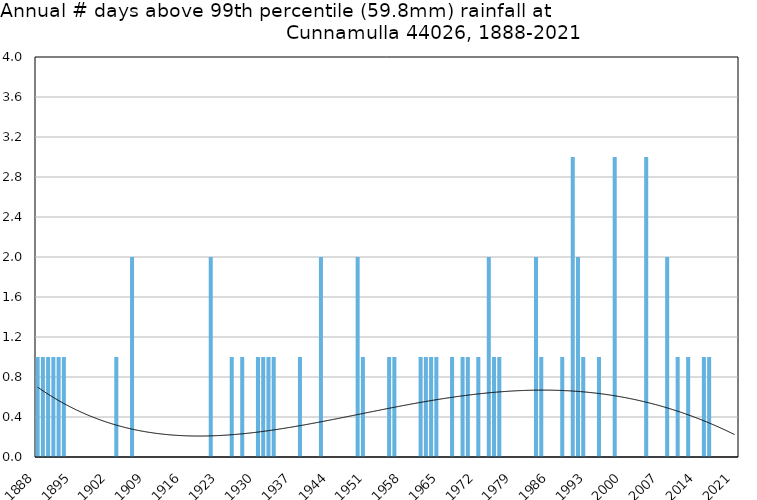
| Category | Annual # days above 99th percentile |
|---|---|
| 1888 | 1 |
| 1889 | 1 |
| 1890 | 1 |
| 1891 | 1 |
| 1892 | 1 |
| 1893 | 1 |
| 1894 | 0 |
| 1895 | 0 |
| 1896 | 0 |
| 1897 | 0 |
| 1898 | 0 |
| 1899 | 0 |
| 1900 | 0 |
| 1901 | 0 |
| 1902 | 0 |
| 1903 | 1 |
| 1904 | 0 |
| 1905 | 0 |
| 1906 | 2 |
| 1907 | 0 |
| 1908 | 0 |
| 1909 | 0 |
| 1910 | 0 |
| 1911 | 0 |
| 1912 | 0 |
| 1913 | 0 |
| 1914 | 0 |
| 1915 | 0 |
| 1916 | 0 |
| 1917 | 0 |
| 1918 | 0 |
| 1919 | 0 |
| 1920 | 0 |
| 1921 | 2 |
| 1922 | 0 |
| 1923 | 0 |
| 1924 | 0 |
| 1925 | 1 |
| 1926 | 0 |
| 1927 | 1 |
| 1928 | 0 |
| 1929 | 0 |
| 1930 | 1 |
| 1931 | 1 |
| 1932 | 1 |
| 1933 | 1 |
| 1934 | 0 |
| 1935 | 0 |
| 1936 | 0 |
| 1937 | 0 |
| 1938 | 1 |
| 1939 | 0 |
| 1940 | 0 |
| 1941 | 0 |
| 1942 | 2 |
| 1943 | 0 |
| 1944 | 0 |
| 1945 | 0 |
| 1946 | 0 |
| 1947 | 0 |
| 1948 | 0 |
| 1949 | 2 |
| 1950 | 1 |
| 1951 | 0 |
| 1952 | 0 |
| 1953 | 0 |
| 1954 | 0 |
| 1955 | 1 |
| 1956 | 1 |
| 1957 | 0 |
| 1958 | 0 |
| 1959 | 0 |
| 1960 | 0 |
| 1961 | 1 |
| 1962 | 1 |
| 1963 | 1 |
| 1964 | 1 |
| 1965 | 0 |
| 1966 | 0 |
| 1967 | 1 |
| 1968 | 0 |
| 1969 | 1 |
| 1970 | 1 |
| 1971 | 0 |
| 1972 | 1 |
| 1973 | 0 |
| 1974 | 2 |
| 1975 | 1 |
| 1976 | 1 |
| 1977 | 0 |
| 1978 | 0 |
| 1979 | 0 |
| 1980 | 0 |
| 1981 | 0 |
| 1982 | 0 |
| 1983 | 2 |
| 1984 | 1 |
| 1985 | 0 |
| 1986 | 0 |
| 1987 | 0 |
| 1988 | 1 |
| 1989 | 0 |
| 1990 | 3 |
| 1991 | 2 |
| 1992 | 1 |
| 1993 | 0 |
| 1994 | 0 |
| 1995 | 1 |
| 1996 | 0 |
| 1997 | 0 |
| 1998 | 3 |
| 1999 | 0 |
| 2000 | 0 |
| 2001 | 0 |
| 2002 | 0 |
| 2003 | 0 |
| 2004 | 3 |
| 2005 | 0 |
| 2006 | 0 |
| 2007 | 0 |
| 2008 | 2 |
| 2009 | 0 |
| 2010 | 1 |
| 2011 | 0 |
| 2012 | 1 |
| 2013 | 0 |
| 2014 | 0 |
| 2015 | 1 |
| 2016 | 1 |
| 2017 | 0 |
| 2018 | 0 |
| 2019 | 0 |
| 2020 | 0 |
| 2021 | 0 |